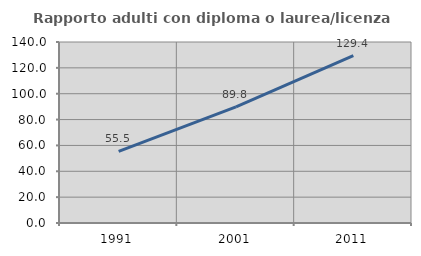
| Category | Rapporto adulti con diploma o laurea/licenza media  |
|---|---|
| 1991.0 | 55.455 |
| 2001.0 | 89.804 |
| 2011.0 | 129.373 |